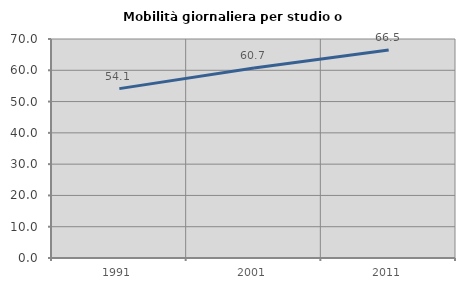
| Category | Mobilità giornaliera per studio o lavoro |
|---|---|
| 1991.0 | 54.135 |
| 2001.0 | 60.705 |
| 2011.0 | 66.5 |